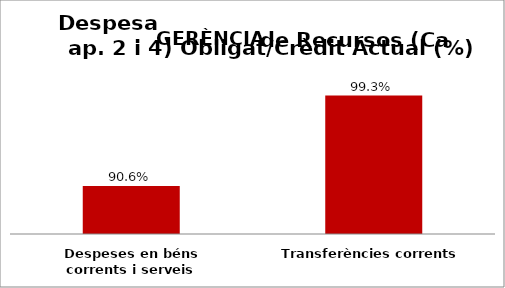
| Category | Series 0 |
|---|---|
| Despeses en béns corrents i serveis | 0.906 |
| Transferències corrents | 0.993 |